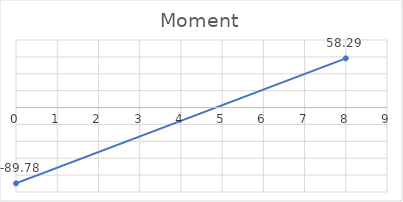
| Category | Series 0 |
|---|---|
| 0.0 | -89.777 |
| 8.0 | 58.286 |